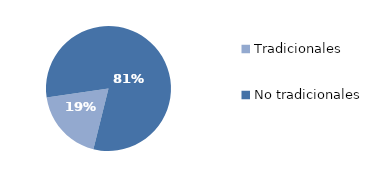
| Category | Series 0 |
|---|---|
| Tradicionales | 549.619 |
| No tradicionales | 2373.08 |